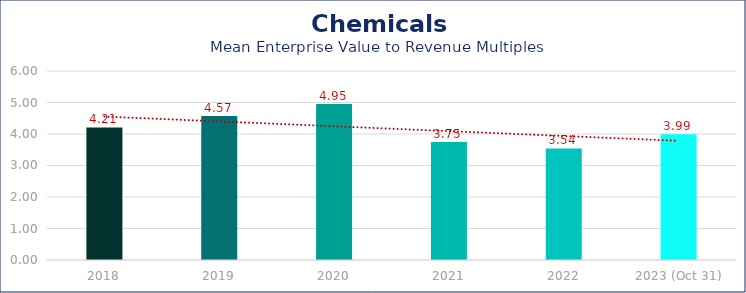
| Category | Chemicals |
|---|---|
| 2018 | 4.21 |
| 2019 | 4.57 |
| 2020 | 4.95 |
| 2021 | 3.75 |
| 2022 | 3.54 |
| 2023 (Oct 31) | 3.99 |